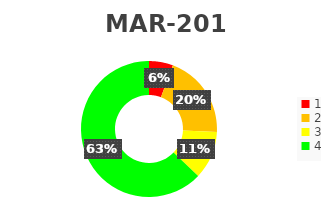
| Category | Series 0 |
|---|---|
| 1.0 | 2 |
| 2.0 | 7 |
| 3.0 | 4 |
| 4.0 | 22 |